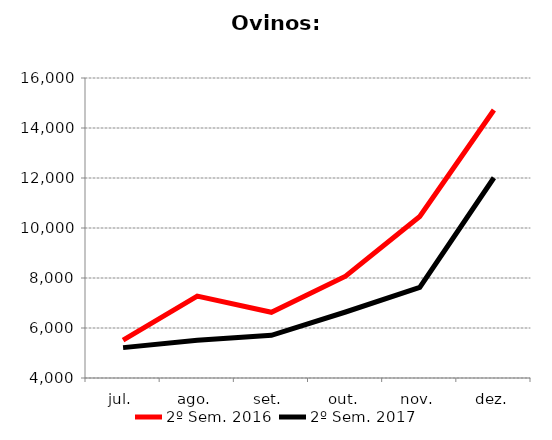
| Category | 2º Sem. 2016 | 2º Sem. 2017 |
|---|---|---|
| jul. | 5516 | 5215 |
| ago. | 7278 | 5506 |
| set. | 6630 | 5708 |
| out. | 8072 | 6640 |
| nov. | 10463 | 7626 |
| dez. | 14719 | 12009 |